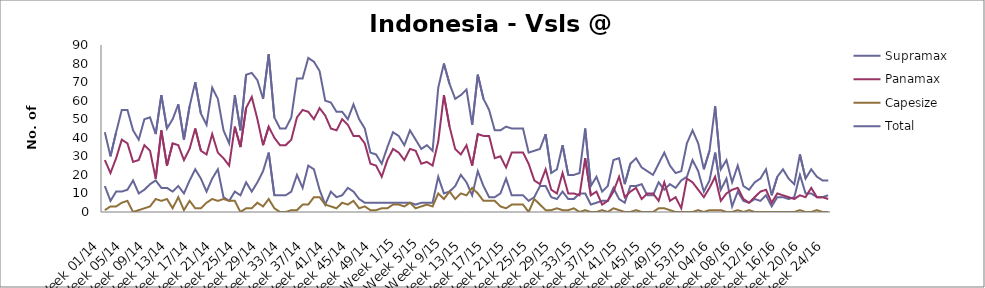
| Category | Supramax | Panamax | Capesize | Total |
|---|---|---|---|---|
| Week 01/14 | 14 | 28 | 1 | 43 |
| Week 02/14 | 6 | 21 | 3 | 30 |
| Week 03/14 | 11 | 29 | 3 | 43 |
| Week 04/14 | 11 | 39 | 5 | 55 |
| Week 05/14 | 12 | 37 | 6 | 55 |
| Week 06/14 | 17 | 27 | 0 | 44 |
| Week 07/14 | 10 | 28 | 1 | 39 |
| Week 08/14 | 12 | 36 | 2 | 50 |
| Week 09/14 | 15 | 33 | 3 | 51 |
| Week 10/14 | 17 | 18 | 7 | 42 |
| Week 11/14 | 13 | 44 | 6 | 63 |
| Week 12/14 | 13 | 25 | 7 | 45 |
| Week 13/14 | 11 | 37 | 2 | 50 |
| Week 14/14 | 14 | 36 | 8 | 58 |
| Week 15/14 | 10 | 28 | 1 | 39 |
| Week 16/14 | 17 | 34 | 6 | 57 |
| Week 17/14 | 23 | 45 | 2 | 70 |
| Week 18/14 | 18 | 33 | 2 | 53 |
| Week 19/14 | 11 | 31 | 5 | 47 |
| Week 20/14 | 18 | 42 | 7 | 67 |
| Week 21/14 | 23 | 32 | 6 | 61 |
| Week 22/14 | 8 | 29 | 7 | 44 |
| Week 23/14 | 6 | 25 | 6 | 37 |
| Week 24/14 | 11 | 46 | 6 | 63 |
| Week 25/14 | 9 | 35 | 0 | 44 |
| Week 26/14 | 16 | 56 | 2 | 74 |
| Week 27/14 | 11 | 62 | 2 | 75 |
| Week 28/14 | 16 | 50 | 5 | 71 |
| Week 29/14 | 22 | 36 | 3 | 61 |
| Week 30/14 | 32 | 46 | 7 | 85 |
| Week 31/14 | 9 | 40 | 2 | 51 |
| Week 32/14 | 9 | 36 | 0 | 45 |
| Week 33/14 | 9 | 36 | 0 | 45 |
| Week 34/14 | 11 | 39 | 1 | 51 |
| Week 35/14 | 20 | 51 | 1 | 72 |
| Week 36/14 | 13 | 55 | 4 | 72 |
| Week 37/14 | 25 | 54 | 4 | 83 |
| Week 38/14 | 23 | 50 | 8 | 81 |
| Week 39/14 | 12 | 56 | 8 | 76 |
| Week 40/14 | 4 | 52 | 4 | 60 |
| Week 41/14 | 11 | 45 | 3 | 59 |
| Week 42/14 | 8 | 44 | 2 | 54 |
| Week 43/14 | 9 | 50 | 5 | 54 |
| Week 44/14 | 13 | 47 | 4 | 50 |
| Week 45/14 | 11 | 41 | 6 | 58 |
| Week 46/14 | 7 | 41 | 2 | 50 |
| Week 47/14 | 5 | 37 | 3 | 45 |
| Week 48/14 | 5 | 26 | 1 | 32 |
| Week 49/14 | 5 | 25 | 1 | 31 |
| Week 50/14 | 5 | 19 | 2 | 26 |
| Week 51/14 | 5 | 28 | 2 | 35 |
| Week 52/14 | 5 | 34 | 4 | 43 |
| Week 1/15 | 5 | 32 | 4 | 41 |
| Week 2/15 | 5 | 28 | 3 | 36 |
| Week 3/15 | 5 | 34 | 5 | 44 |
| Week 4/15 | 4 | 33 | 2 | 39 |
| Week 5/15 | 5 | 26 | 3 | 34 |
| Week 6/15 | 5 | 27 | 4 | 36 |
| Week 7/15 | 5 | 25 | 3 | 33 |
| Week 8/15 | 19 | 38 | 10 | 67 |
| Week 9/15 | 10 | 63 | 7 | 80 |
| Week 10/15 | 11 | 46 | 11 | 69 |
| Week 11/15 | 14 | 34 | 7 | 61 |
| Week 12/15 | 20 | 31 | 10 | 63 |
| Week 13/15 | 16 | 36 | 9 | 66 |
| Week 14/15 | 9 | 25 | 13 | 47 |
| Week 15/15 | 22 | 42 | 10 | 74 |
| Week 16/15 | 14 | 41 | 6 | 61 |
| Week 17/15 | 8 | 41 | 6 | 55 |
| Week 18/15 | 8 | 29 | 6 | 44 |
| Week 19/15 | 10 | 30 | 3 | 44 |
| Week 20/15 | 18 | 24 | 2 | 46 |
| Week 21/15 | 9 | 32 | 4 | 45 |
| Week 22/15 | 9 | 32 | 4 | 45 |
| Week 23/15 | 9 | 32 | 4 | 45 |
| Week 24/15 | 6 | 26 | 0 | 32 |
| Week 25/15 | 8 | 17 | 7 | 33 |
| Week 26/15 | 14 | 15 | 4 | 34 |
| Week 27/15 | 14 | 23 | 1 | 42 |
| Week 28/15 | 8 | 12 | 1 | 21 |
| Week 29/15 | 7 | 10 | 2 | 23 |
| Week 30/15 | 11 | 21 | 1 | 36 |
| Week 31/15 | 7 | 10 | 1 | 20 |
| Week 32/15 | 7 | 10 | 2 | 20 |
| Week 33/15 | 10 | 9 | 0 | 21 |
| Week 34/15 | 10 | 29 | 1 | 45 |
| Week 35/15 | 4 | 9 | 0 | 14 |
| Week 36/15 | 5 | 11 | 0 | 19 |
| Week 37/15 | 6 | 4 | 1 | 11 |
| Week 38/15 | 6 | 6 | 0 | 14 |
| Week 39/15 | 13 | 11 | 2 | 28 |
| Week 40/15 | 7 | 19 | 1 | 29 |
| Week 41/15 | 5 | 8 | 0 | 15 |
| Week 42/15 | 14 | 11 | 0 | 26 |
| Week 43/15 | 14 | 13 | 1 | 29 |
| Week 44/15 | 15 | 7 | 0 | 24 |
| Week 45/15 | 9 | 10 | 0 | 22 |
| Week 46/15 | 9 | 10 | 0 | 20 |
| Week 47/15 | 16 | 6 | 2 | 26 |
| Week 48/15 | 12 | 16 | 2 | 32 |
| Week 49/15 | 15 | 6 | 1 | 25 |
| Week 50/15 | 13 | 8 | 0 | 21 |
| Week 51/15 | 17 | 2 | 0 | 22 |
| Week 52/15 | 19 | 18 | 0 | 37 |
| Week 53/15 | 28 | 16 | 0 | 44 |
| Week 01/16 | 22 | 12 | 1 | 37 |
| Week 02/16 | 11 | 8 | 0 | 23 |
| Week 03/16 | 17 | 13 | 1 | 33 |
| Week 04/16 | 32 | 19 | 1 | 57 |
| Week 05/16 | 12 | 6 | 1 | 23 |
| Week 06/16 | 18 | 10 | 0 | 28 |
| Week 07/16 | 3 | 12 | 0 | 16 |
| Week 08/16 | 11 | 13 | 1 | 25 |
| Week 09/16 | 6 | 7 | 0 | 14 |
| Week 10/16 | 5 | 5 | 1 | 12 |
| Week 11/16 | 7 | 8 | 0 | 16 |
| Week 12/16 | 6 | 11 | 0 | 18 |
| Week 13/16 | 9 | 12 | 0 | 23 |
| Week 14/16 | 3 | 5 | 0 | 9 |
| Week 15/16 | 8 | 10 | 0 | 19 |
| Week 16/16 | 8 | 9 | 0 | 23 |
| Week 17/16 | 7 | 8 | 0 | 18 |
| Week 18/16 | 8 | 7 | 0 | 15 |
| Week 19/16 | 20 | 9 | 1 | 31 |
| Week 20/16 | 10 | 8 | 0 | 18 |
| Week 21/16 | 10 | 13 | 0 | 23 |
| Week 22/16 | 8 | 8 | 1 | 19 |
| Week 23/16 | 8 | 8 | 0 | 17 |
| Week 24/16 | 9 | 7 | 0 | 17 |